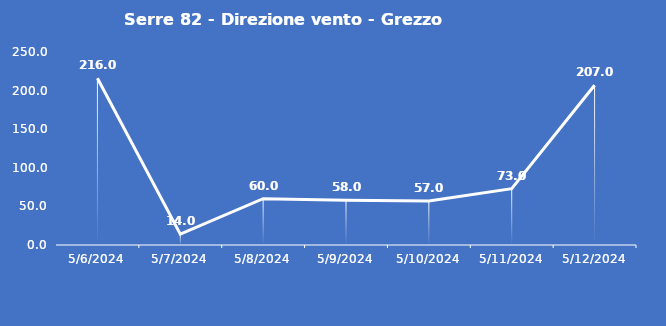
| Category | Serre 82 - Direzione vento - Grezzo (°N) |
|---|---|
| 5/6/24 | 216 |
| 5/7/24 | 14 |
| 5/8/24 | 60 |
| 5/9/24 | 58 |
| 5/10/24 | 57 |
| 5/11/24 | 73 |
| 5/12/24 | 207 |